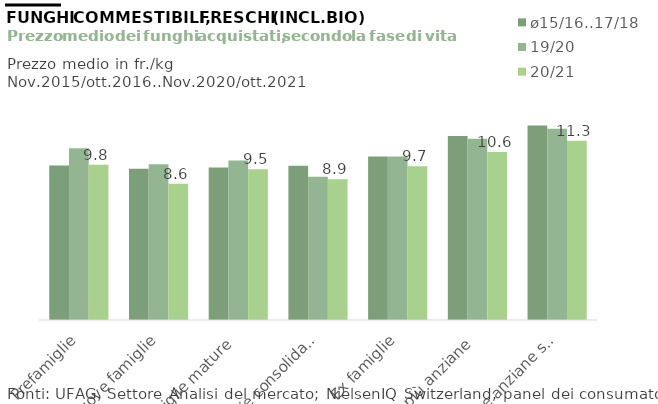
| Category | ø15/16..17/18 | 19/20 | 20/21 |
|---|---|---|---|
| Prefamiglie | 9.748 | 10.828 | 9.784 |
| Nuove famiglie | 9.532 | 9.824 | 8.587 |
| Famiglie mature | 9.609 | 10.051 | 9.503 |
| Famiglie consolidate | 9.721 | 9.029 | 8.871 |
| Ex famiglie | 10.31 | 10.315 | 9.697 |
| Coppie più anziane | 11.598 | 11.424 | 10.594 |
| Persone anziane sole | 12.26 | 12.061 | 11.309 |